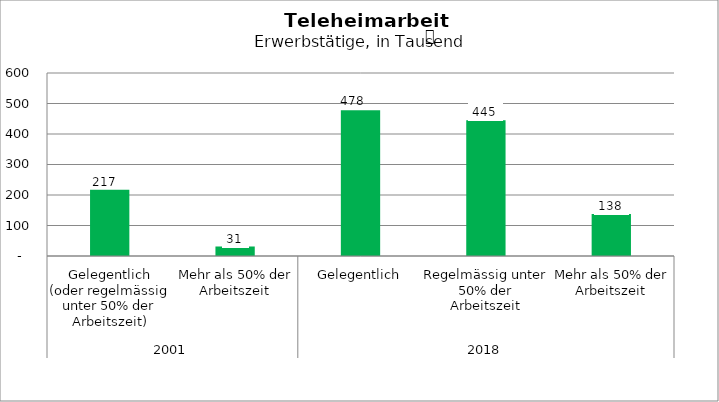
| Category | Teleheimarbeit |
|---|---|
| 0 | 217 |
| 1 | 31 |
| 2 | 478 |
| 3 | 445 |
| 4 | 138 |